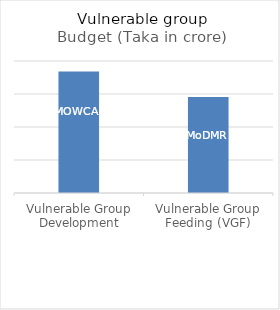
| Category | Budget (Taka in crore) |
|---|---|
| Vulnerable Group Development | 1840.05 |
| Vulnerable Group Feeding (VGF) | 1455.54 |